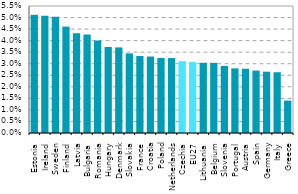
| Category | Series 0 |
|---|---|
| Estonia | 0.051 |
| Ireland | 0.051 |
| Sweden | 0.05 |
| Finland | 0.046 |
| Latvia | 0.043 |
| Bulgaria | 0.043 |
| Romania | 0.04 |
| Hungary | 0.037 |
| Denmark | 0.037 |
| Slovakia | 0.034 |
| France | 0.033 |
| Croatia | 0.033 |
| Poland | 0.032 |
| Netherlands | 0.032 |
| Czechia | 0.031 |
| EU27 | 0.031 |
| Lithuania | 0.03 |
| Belgium | 0.03 |
| Slovenia | 0.029 |
| Portugal | 0.028 |
| Austria | 0.028 |
| Spain | 0.027 |
| Germany | 0.027 |
| Italy | 0.026 |
| Greece | 0.014 |